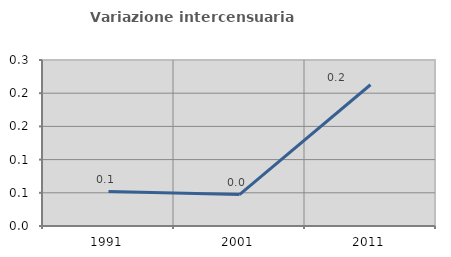
| Category | Variazione intercensuaria annua |
|---|---|
| 1991.0 | 0.052 |
| 2001.0 | 0.047 |
| 2011.0 | 0.213 |